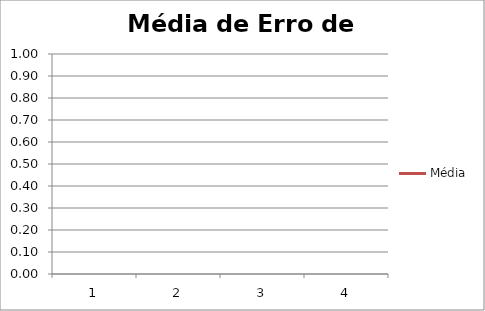
| Category | Média |
|---|---|
| 1.0 | 0 |
| 2.0 | 0 |
| 3.0 | 0 |
| 4.0 | 0 |